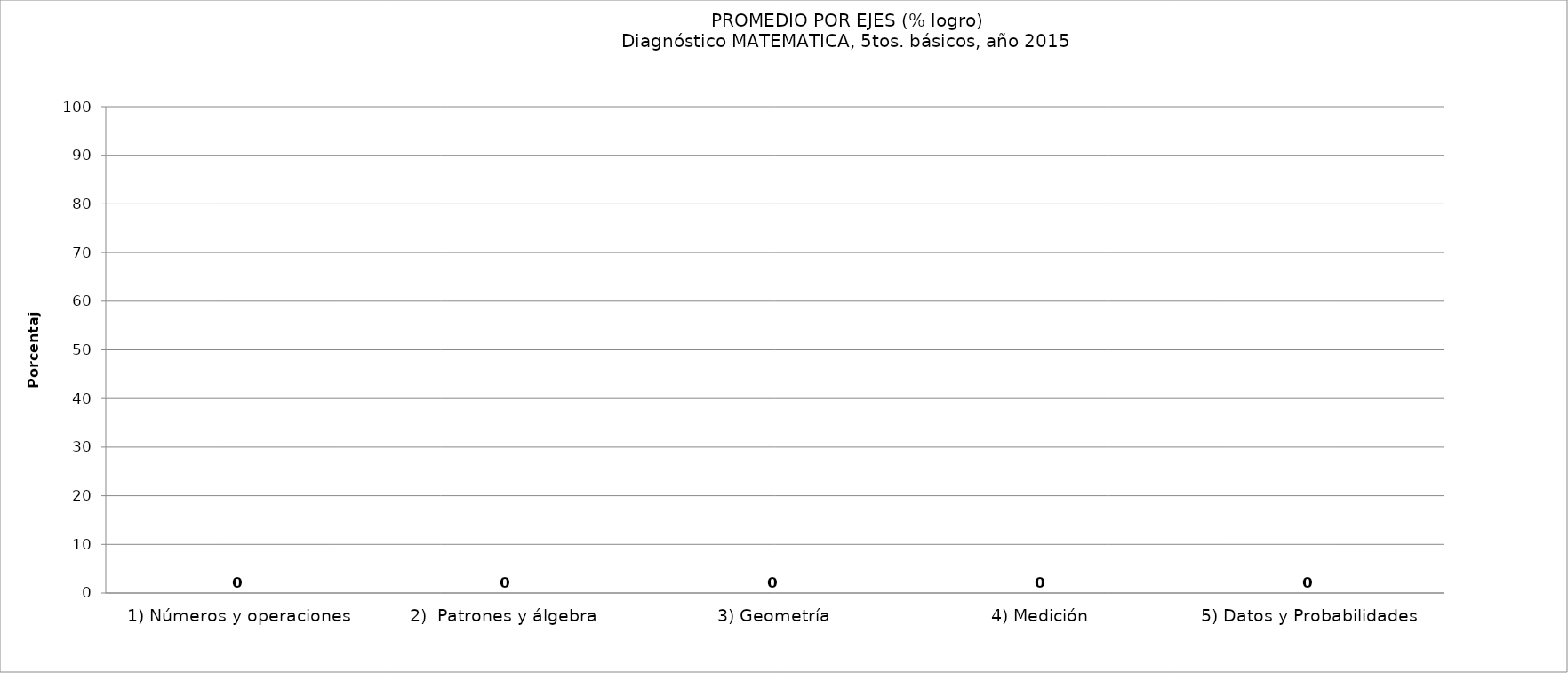
| Category | Series 0 |
|---|---|
| 1) Números y operaciones | 0 |
| 2)  Patrones y álgebra  | 0 |
| 3) Geometría | 0 |
| 4) Medición | 0 |
| 5) Datos y Probabilidades | 0 |